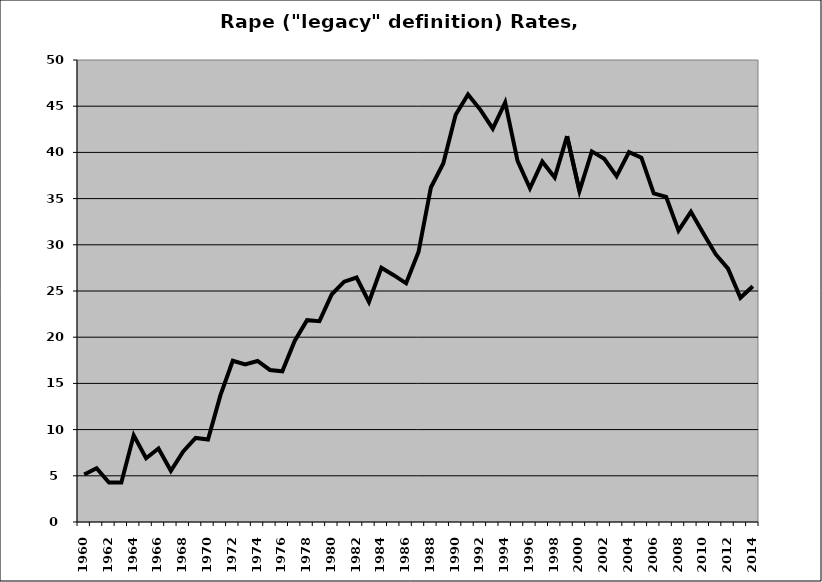
| Category | Rape |
|---|---|
| 1960.0 | 5.142 |
| 1961.0 | 5.824 |
| 1962.0 | 4.27 |
| 1963.0 | 4.279 |
| 1964.0 | 9.378 |
| 1965.0 | 6.894 |
| 1966.0 | 7.95 |
| 1967.0 | 5.537 |
| 1968.0 | 7.643 |
| 1969.0 | 9.099 |
| 1970.0 | 8.931 |
| 1971.0 | 13.702 |
| 1972.0 | 17.455 |
| 1973.0 | 17.054 |
| 1974.0 | 17.427 |
| 1975.0 | 16.454 |
| 1976.0 | 16.313 |
| 1977.0 | 19.59 |
| 1978.0 | 21.839 |
| 1979.0 | 21.737 |
| 1980.0 | 24.647 |
| 1981.0 | 26.008 |
| 1982.0 | 26.46 |
| 1983.0 | 23.811 |
| 1984.0 | 27.521 |
| 1985.0 | 26.713 |
| 1986.0 | 25.829 |
| 1987.0 | 29.219 |
| 1988.0 | 36.201 |
| 1989.0 | 38.802 |
| 1990.0 | 44.069 |
| 1991.0 | 46.258 |
| 1992.0 | 44.606 |
| 1993.0 | 42.565 |
| 1994.0 | 45.41 |
| 1995.0 | 39.08 |
| 1996.0 | 36.119 |
| 1997.0 | 38.997 |
| 1998.0 | 37.282 |
| 1999.0 | 41.754 |
| 2000.0 | 35.822 |
| 2001.0 | 40.109 |
| 2002.0 | 39.313 |
| 2003.0 | 37.432 |
| 2004.0 | 40.024 |
| 2005.0 | 39.436 |
| 2006.0 | 35.56 |
| 2007.0 | 35.186 |
| 2008.0 | 31.528 |
| 2009.0 | 33.571 |
| 2010.0 | 31.241 |
| 2011.0 | 28.984 |
| 2012.0 | 27.424 |
| 2013.0 | 24.263 |
| 2014.0 | 25.517 |